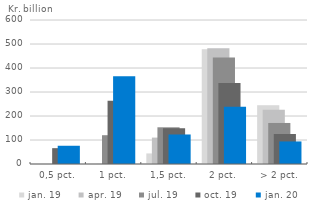
| Category | jan. 19 | apr. 19 | jul. 19 | oct. 19 | jan. 20 |
|---|---|---|---|---|---|
| 0,5 pct. | 0 | 0 | 0 | 66 | 76 |
| 1 pct. | 0 | 0.557 | 120 | 264 | 366 |
| 1,5 pct. | 44 | 110 | 153 | 149 | 123 |
| 2 pct. | 478 | 482 | 444 | 337 | 239 |
| > 2 pct. | 245 | 226 | 171 | 125 | 94 |